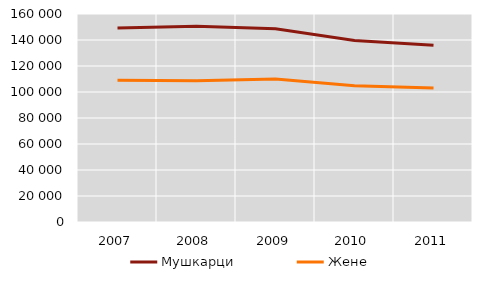
| Category | Мушкарци | Жене |
|---|---|---|
| 2007.0 | 149201 | 109035 |
| 2008.0 | 150569 | 108636 |
| 2009.0 | 148713 | 109921 |
| 2010.0 | 139554 | 104899 |
| 2011.0 | 135945 | 103011 |